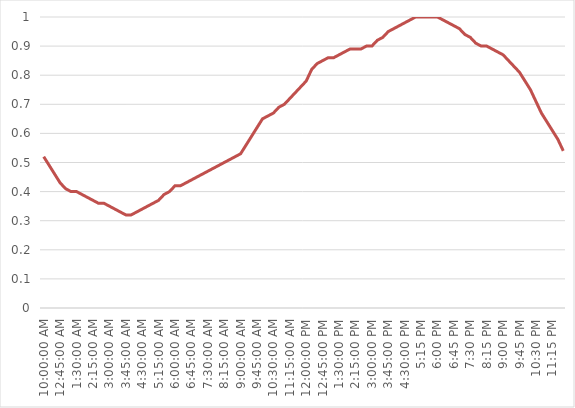
| Category | Series 1 |
|---|---|
| 0.0 | 0.52 |
| 0.010416666666666666 | 0.49 |
| 0.020833333333333332 | 0.46 |
| 0.03125 | 0.43 |
| 0.041666666666666664 | 0.41 |
| 0.052083333333333336 | 0.4 |
| 0.0625 | 0.4 |
| 0.07291666666666667 | 0.39 |
| 0.08333333333333333 | 0.38 |
| 0.09375 | 0.37 |
| 0.10416666666666667 | 0.36 |
| 0.11458333333333333 | 0.36 |
| 0.125 | 0.35 |
| 0.13541666666666666 | 0.34 |
| 0.14583333333333334 | 0.33 |
| 0.15625 | 0.32 |
| 0.16666666666666666 | 0.32 |
| 0.17708333333333334 | 0.33 |
| 0.1875 | 0.34 |
| 0.19791666666666666 | 0.35 |
| 0.20833333333333334 | 0.36 |
| 0.21875 | 0.37 |
| 0.22916666666666666 | 0.39 |
| 0.23958333333333334 | 0.4 |
| 0.25 | 0.42 |
| 0.2604166666666667 | 0.42 |
| 0.2708333333333333 | 0.43 |
| 0.28125 | 0.44 |
| 0.2916666666666667 | 0.45 |
| 0.3020833333333333 | 0.46 |
| 0.3125 | 0.47 |
| 0.3229166666666667 | 0.48 |
| 0.3333333333333333 | 0.49 |
| 0.34375 | 0.5 |
| 0.3541666666666667 | 0.51 |
| 0.3645833333333333 | 0.52 |
| 0.375 | 0.53 |
| 0.3854166666666667 | 0.56 |
| 0.3958333333333333 | 0.59 |
| 0.40625 | 0.62 |
| 0.4166666666666667 | 0.65 |
| 0.4270833333333333 | 0.66 |
| 0.4375 | 0.67 |
| 0.4479166666666667 | 0.69 |
| 0.4583333333333333 | 0.7 |
| 0.46875 | 0.72 |
| 0.4791666666666667 | 0.74 |
| 0.4895833333333333 | 0.76 |
| 0.5 | 0.78 |
| 0.5104166666666666 | 0.82 |
| 0.5208333333333334 | 0.84 |
| 0.53125 | 0.85 |
| 0.5416666666666666 | 0.86 |
| 0.5520833333333334 | 0.86 |
| 0.5625 | 0.87 |
| 0.5729166666666666 | 0.88 |
| 0.5833333333333334 | 0.89 |
| 0.59375 | 0.89 |
| 0.6041666666666666 | 0.89 |
| 0.6145833333333334 | 0.9 |
| 0.625 | 0.9 |
| 0.6354166666666666 | 0.92 |
| 0.6458333333333334 | 0.93 |
| 0.65625 | 0.95 |
| 1900-01-01 16:00:00 | 0.96 |
| 0.6770833333333334 | 0.97 |
| 0.6875 | 0.98 |
| 0.6979166666666666 | 0.99 |
| 0.7083333333333334 | 1 |
| 0.71875 | 1 |
| 0.7291666666666666 | 1 |
| 0.7395833333333334 | 1 |
| 0.75 | 1 |
| 0.7604166666666666 | 0.99 |
| 0.7708333333333334 | 0.98 |
| 0.78125 | 0.97 |
| 0.7916666666666666 | 0.96 |
| 0.8020833333333334 | 0.94 |
| 0.8125 | 0.93 |
| 0.8229166666666666 | 0.91 |
| 0.8333333333333334 | 0.9 |
| 0.84375 | 0.9 |
| 0.8541666666666666 | 0.89 |
| 0.8645833333333334 | 0.88 |
| 0.875 | 0.87 |
| 0.8854166666666666 | 0.85 |
| 0.8958333333333334 | 0.83 |
| 0.90625 | 0.81 |
| 0.9166666666666666 | 0.78 |
| 0.9270833333333334 | 0.75 |
| 0.9375 | 0.71 |
| 0.9479166666666666 | 0.67 |
| 0.9583333333333334 | 0.64 |
| 0.96875 | 0.61 |
| 0.9791666666666666 | 0.58 |
| 0.9895833333333334 | 0.54 |